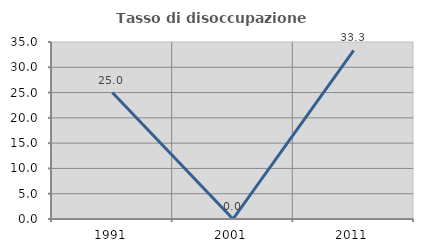
| Category | Tasso di disoccupazione giovanile  |
|---|---|
| 1991.0 | 25 |
| 2001.0 | 0 |
| 2011.0 | 33.333 |